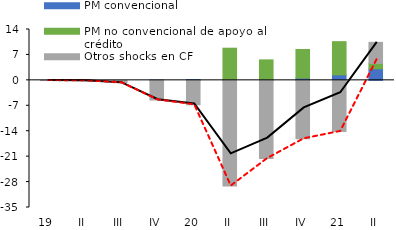
| Category | PM convencional | PM no convencional de apoyo al crédito | Otros shocks en CF |
|---|---|---|---|
| 0 | 0 | 0 | -0.056 |
| 1 | 0 | 0 | -0.117 |
| 2 | 0 | 0 | -0.644 |
| 3 | 0.082 | 0 | -5.405 |
| 4 | 0.216 | 0 | -6.721 |
| 5 | 0.07 | 8.781 | -29.085 |
| 6 | 0.16 | 5.471 | -21.513 |
| 7 | 0.62 | 7.872 | -16.078 |
| 8 | 1.523 | 9.132 | -14.057 |
| 9 | 3.189 | 1.471 | 5.802 |